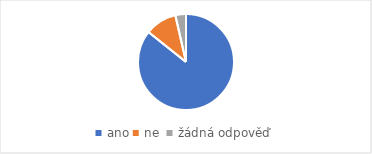
| Category | Series 0 |
|---|---|
| ano | 24 |
| ne  | 3 |
| žádná odpověď | 1 |